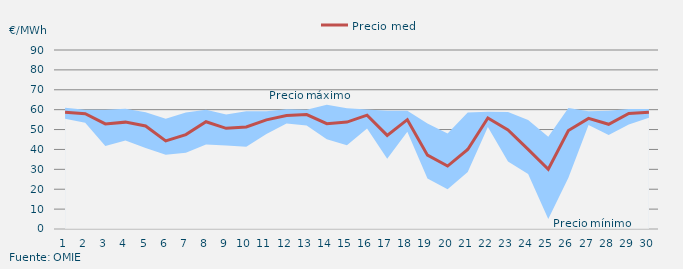
| Category | Precio medio |
|---|---|
| 1 | 58.647 |
| 2 | 57.939 |
| 3 | 52.841 |
| 4 | 53.732 |
| 5 | 51.808 |
| 6 | 44.29 |
| 7 | 47.467 |
| 8 | 53.935 |
| 9 | 50.627 |
| 10 | 51.289 |
| 11 | 54.863 |
| 12 | 57.06 |
| 13 | 57.507 |
| 14 | 52.968 |
| 15 | 53.774 |
| 16 | 57.257 |
| 17 | 47.053 |
| 18 | 54.974 |
| 19 | 37.131 |
| 20 | 31.655 |
| 21 | 39.993 |
| 22 | 55.839 |
| 23 | 49.786 |
| 24 | 40.007 |
| 25 | 30.046 |
| 26 | 49.542 |
| 27 | 55.623 |
| 28 | 52.659 |
| 29 | 58.133 |
| 30 | 58.747 |